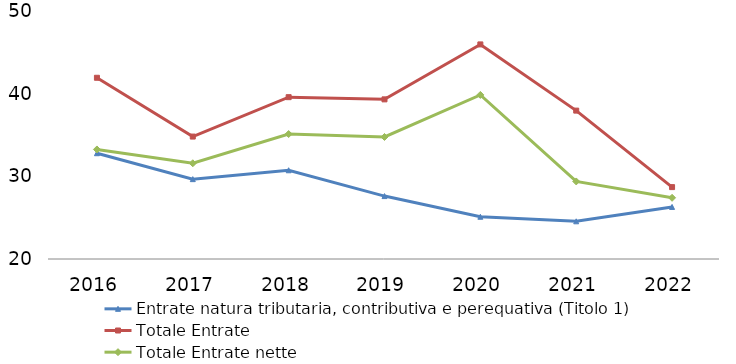
| Category | Entrate natura tributaria, contributiva e perequativa (Titolo 1) | Totale Entrate | Totale Entrate nette |
|---|---|---|---|
| 2016.0 | 32.795 | 41.922 | 33.252 |
| 2017.0 | 29.66 | 34.809 | 31.58 |
| 2018.0 | 30.734 | 39.577 | 35.116 |
| 2019.0 | 27.611 | 39.311 | 34.758 |
| 2020.0 | 25.111 | 45.957 | 39.85 |
| 2021.0 | 24.56 | 37.949 | 29.382 |
| 2022.0 | 26.298 | 28.696 | 27.403 |